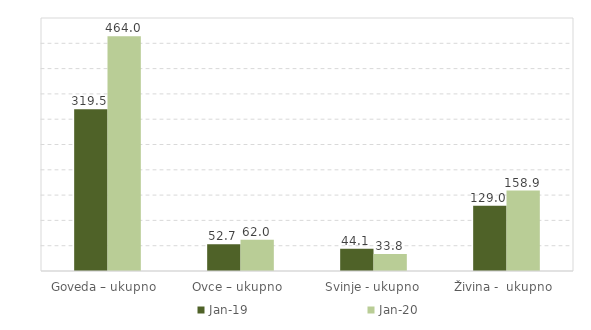
| Category | Jan-19 | Jan-20 |
|---|---|---|
| Goveda – ukupno  | 319.5 | 464 |
| Ovce – ukupno  | 52.7 | 62 |
| Svinje - ukupno | 44.1 | 33.8 |
| Živina -  ukupno  | 129 | 158.9 |